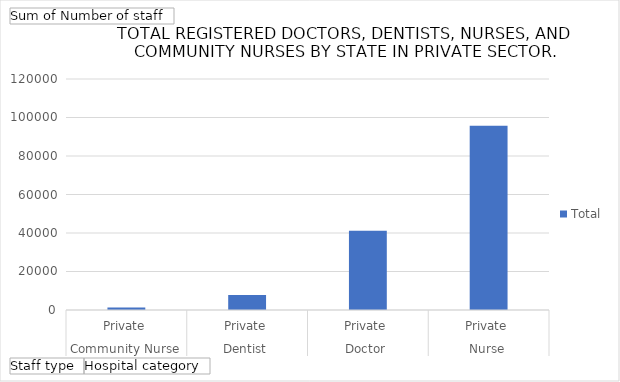
| Category | Total |
|---|---|
| 0 | 1353 |
| 1 | 7820 |
| 2 | 41113 |
| 3 | 95683 |